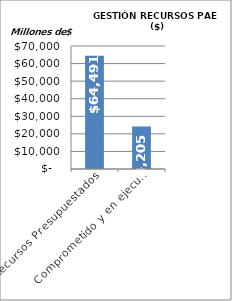
| Category | Series 0 |
|---|---|
| Recursos Presupuestados | 64490.937 |
| Comprometido y en ejecución  | 24204.619 |